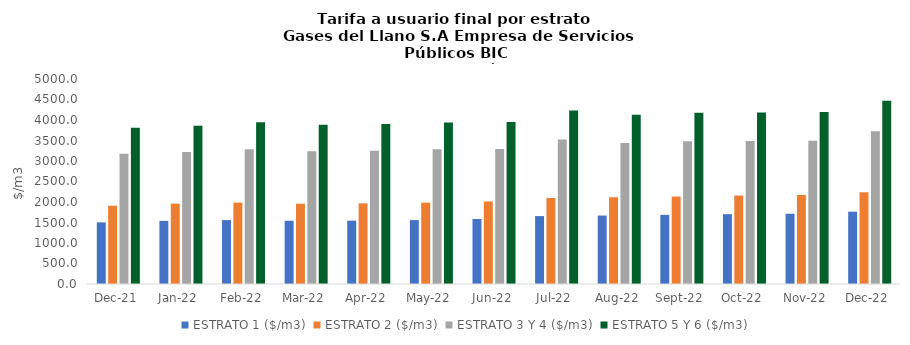
| Category | ESTRATO 1 ($/m3) | ESTRATO 2 ($/m3) | ESTRATO 3 Y 4 ($/m3) | ESTRATO 5 Y 6 ($/m3) |
|---|---|---|---|---|
| 2021-12-01 | 1503.37 | 1908.8 | 3176.73 | 3812.076 |
| 2022-01-01 | 1539.93 | 1960.98 | 3216.6 | 3859.92 |
| 2022-02-01 | 1558.18 | 1985.61 | 3289.23 | 3947.076 |
| 2022-03-01 | 1542.04 | 1958.44 | 3238.74 | 3886.488 |
| 2022-04-01 | 1544.93 | 1966.39 | 3252.39 | 3902.868 |
| 2022-05-01 | 1558.87 | 1984.13 | 3284.52 | 3941.424 |
| 2022-06-01 | 1584.89 | 2012.95 | 3290.9 | 3949.08 |
| 2022-07-01 | 1656.22 | 2098.37 | 3524.51 | 4229.412 |
| 2022-08-01 | 1669.64 | 2115.37 | 3440.02 | 4128.024 |
| 2022-09-01 | 1686.8 | 2137.11 | 3480.88 | 4177.056 |
| 2022-10-01 | 1702.57 | 2157.09 | 3487.76 | 4185.312 |
| 2022-11-01 | 1714.74 | 2172.52 | 3496.7 | 4196.04 |
| 2022-12-01 | 1763.93 | 2235.71 | 3725.2 | 4470.24 |